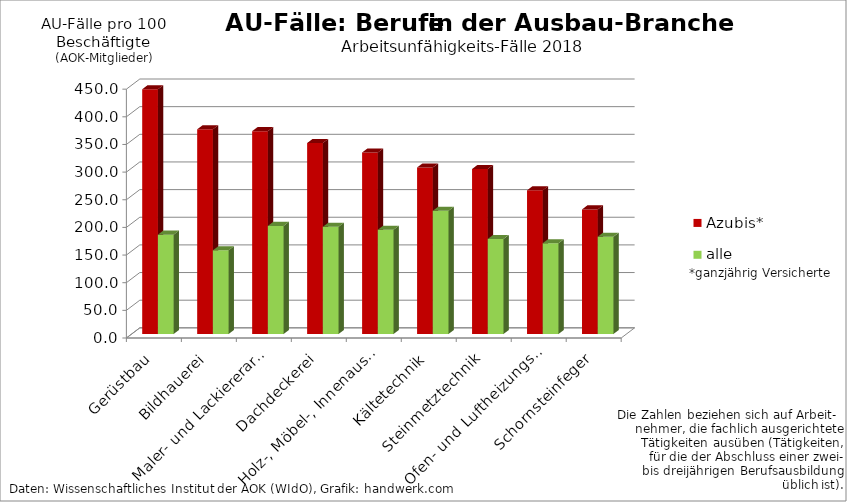
| Category | Azubis* | alle Beschäftigte* |
|---|---|---|
| Gerüstbau | 442.631 | 179.674 |
| Bildhauerei | 370.206 | 151.323 |
| Maler- und Lackiererarbeiten | 366.863 | 195.503 |
| Dachdeckerei | 345.403 | 193.84 |
| Holz-, Möbel-, Innenausbau | 328.248 | 188.573 |
| Kältetechnik | 301.211 | 222.854 |
| Steinmetztechnik | 298.426 | 171.951 |
| Ofen- und Luftheizungsbau | 259.868 | 164.236 |
| Schornsteinfeger | 225.353 | 176.029 |